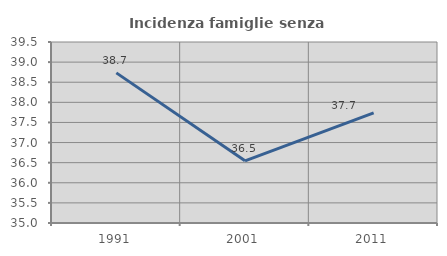
| Category | Incidenza famiglie senza nuclei |
|---|---|
| 1991.0 | 38.732 |
| 2001.0 | 36.545 |
| 2011.0 | 37.736 |